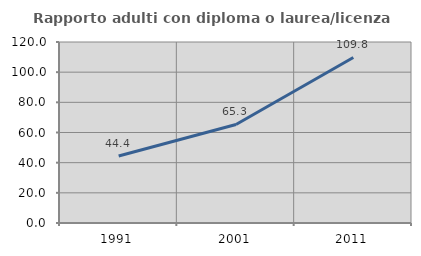
| Category | Rapporto adulti con diploma o laurea/licenza media  |
|---|---|
| 1991.0 | 44.444 |
| 2001.0 | 65.306 |
| 2011.0 | 109.756 |